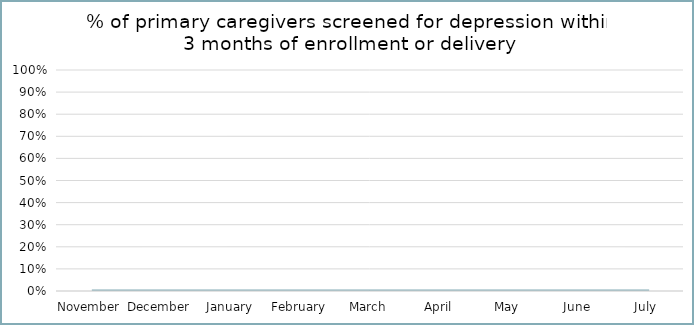
| Category | Series 0 |
|---|---|
| November | 0 |
| December | 0 |
| January | 0 |
| February | 0 |
| March | 0 |
| April | 0 |
| May | 0 |
| June | 0 |
| July  | 0 |